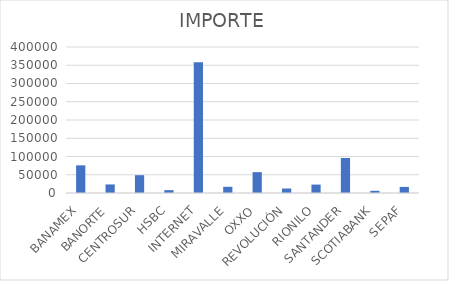
| Category | IMPORTE |
|---|---|
| BANAMEX | 75763.4 |
| BANORTE | 23472.69 |
| CENTROSUR | 48760 |
| HSBC | 7789.48 |
| INTERNET | 358067.9 |
| MIRAVALLE | 16915 |
| OXXO | 57183.32 |
| REVOLUCIÓN | 12254 |
| RIONILO | 23048 |
| SANTANDER | 95838.18 |
| SCOTIABANK | 6012.36 |
| SEPAF | 16666.6 |